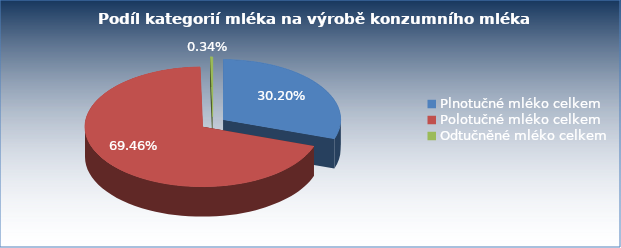
| Category | 2019                       množství (1000 t) |
|---|---|
| Plnotučné mléko celkem | 185.43 |
| Polotučné mléko celkem | 426.44 |
| Odtučněné mléko celkem | 2.1 |